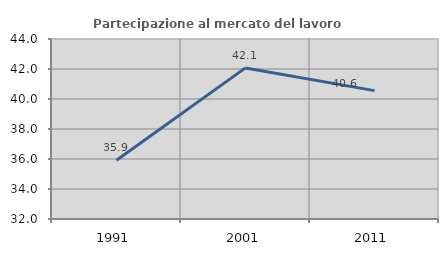
| Category | Partecipazione al mercato del lavoro  femminile |
|---|---|
| 1991.0 | 35.912 |
| 2001.0 | 42.073 |
| 2011.0 | 40.559 |